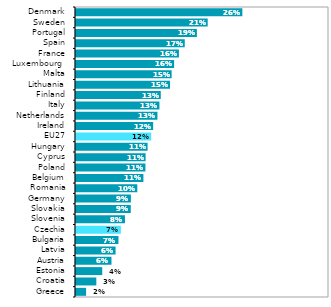
| Category | Series 1 |
|---|---|
| Greece | 0.016 |
| Croatia | 0.032 |
| Estonia | 0.042 |
| Austria | 0.056 |
| Latvia | 0.063 |
| Bulgaria | 0.067 |
| Czechia | 0.071 |
| Slovenia | 0.077 |
| Slovakia | 0.087 |
| Germany | 0.087 |
| Romania | 0.097 |
| Belgium | 0.107 |
| Poland | 0.11 |
| Cyprus | 0.11 |
| Hungary | 0.113 |
| EU27 | 0.119 |
| Ireland | 0.122 |
| Netherlands | 0.129 |
| Italy | 0.132 |
| Finland | 0.134 |
| Lithuania | 0.149 |
| Malta | 0.151 |
| Luxembourg  | 0.155 |
| France | 0.163 |
| Spain | 0.172 |
| Portugal | 0.191 |
| Sweden | 0.208 |
| Denmark | 0.263 |